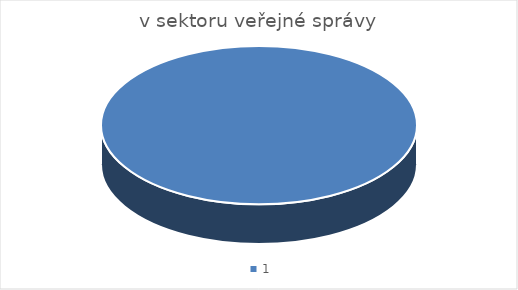
| Category | v sektoru veřejné správy | ve společnosti EG. D |
|---|---|---|
| 0 | 102 | 95 |